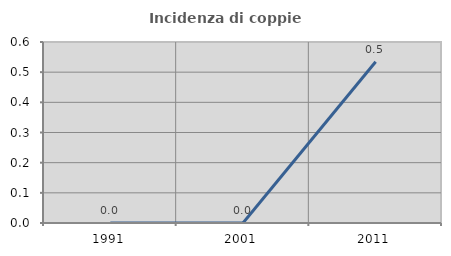
| Category | Incidenza di coppie miste |
|---|---|
| 1991.0 | 0 |
| 2001.0 | 0 |
| 2011.0 | 0.535 |